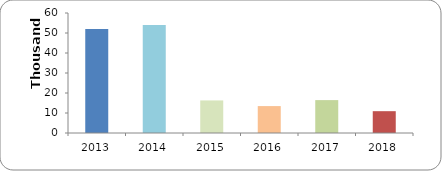
| Category | PERSONAS CAPACITADAS |
|---|---|
| 2013.0 | 52026 |
| 2014.0 | 53944 |
| 2015.0 | 16285 |
| 2016.0 | 13454 |
| 2017.0 | 16445 |
| 2018.0 | 10909 |